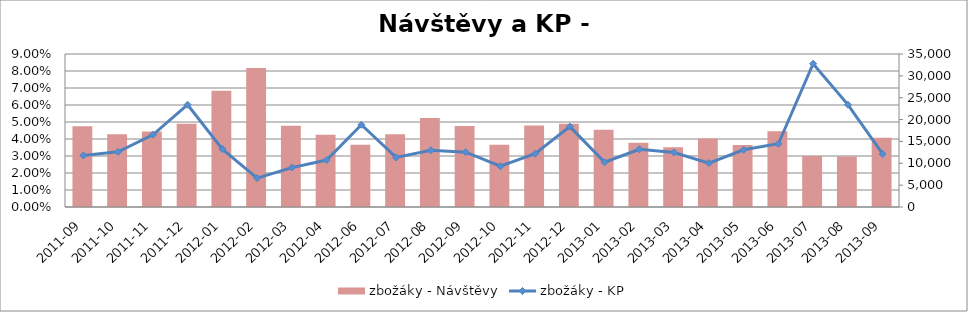
| Category | zbožáky - Návštěvy |
|---|---|
| 2011-09 | 18469.279 |
| 2011-10 | 16641.504 |
| 2011-11 | 17249.73 |
| 2011-12 | 19040.951 |
| 2012-01 | 26585.64 |
| 2012-02 | 31773.054 |
| 2012-03 | 18561.841 |
| 2012-04 | 16529.389 |
| 2012-06 | 14224.008 |
| 2012-07 | 16627.622 |
| 2012-08 | 20336.664 |
| 2012-09 | 18529.956 |
| 2012-10 | 14250.219 |
| 2012-11 | 18646.267 |
| 2012-12 | 19063.319 |
| 2013-01 | 17663.253 |
| 2013-02 | 14725.06 |
| 2013-03 | 13693.766 |
| 2013-04 | 15665.444 |
| 2013-05 | 14179.967 |
| 2013-06 | 17325.872 |
| 2013-07 | 11647.188 |
| 2013-08 | 11537.592 |
| 2013-09 | 15851.897 |